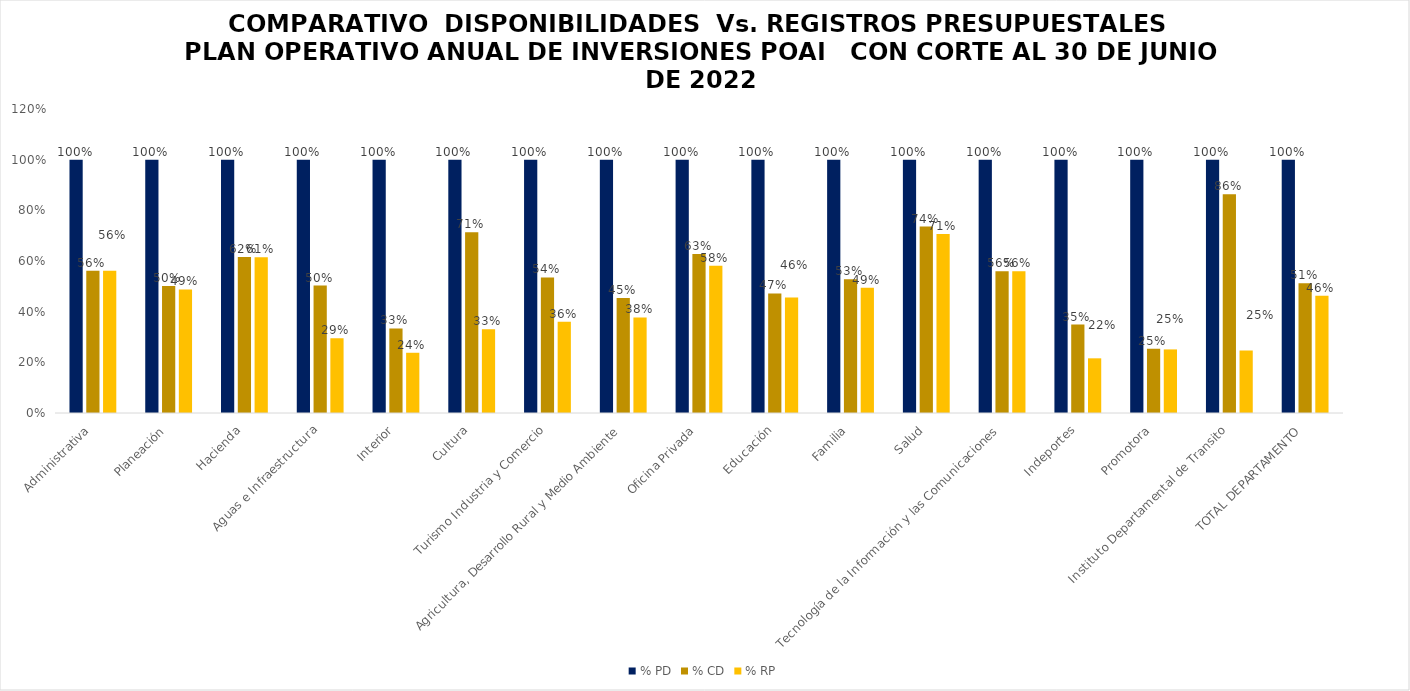
| Category | % PD | % CD | % RP |
|---|---|---|---|
| Administrativa | 1 | 0.561 | 0.561 |
| Planeación | 1 | 0.501 | 0.488 |
| Hacienda | 1 | 0.616 | 0.615 |
| Aguas e Infraestructura | 1 | 0.503 | 0.295 |
| Interior | 1 | 0.334 | 0.238 |
| Cultura | 1 | 0.713 | 0.33 |
| Turismo Industria y Comercio | 1 | 0.535 | 0.36 |
| Agricultura, Desarrollo Rural y Medio Ambiente | 1 | 0.454 | 0.377 |
| Oficina Privada | 1 | 0.627 | 0.581 |
| Educación | 1 | 0.472 | 0.456 |
| Familia | 1 | 0.528 | 0.494 |
| Salud | 1 | 0.736 | 0.707 |
| Tecnología de la Información y las Comunicaciones | 1 | 0.56 | 0.56 |
| Indeportes | 1 | 0.349 | 0.216 |
| Promotora | 1 | 0.253 | 0.251 |
| Instituto Departamental de Transito | 1 | 0.863 | 0.247 |
| TOTAL DEPARTAMENTO | 1 | 0.512 | 0.462 |